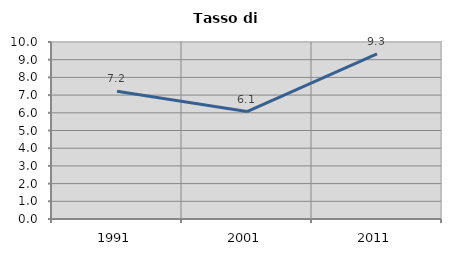
| Category | Tasso di disoccupazione   |
|---|---|
| 1991.0 | 7.22 |
| 2001.0 | 6.071 |
| 2011.0 | 9.326 |